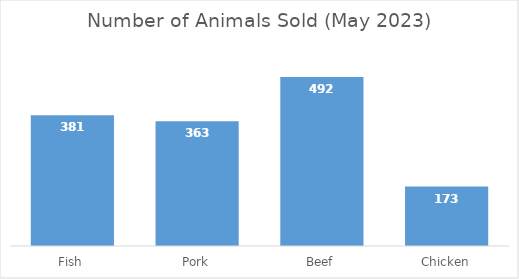
| Category | Count |
|---|---|
| Fish | 381 |
| Pork | 363 |
| Beef | 492 |
| Chicken | 173 |